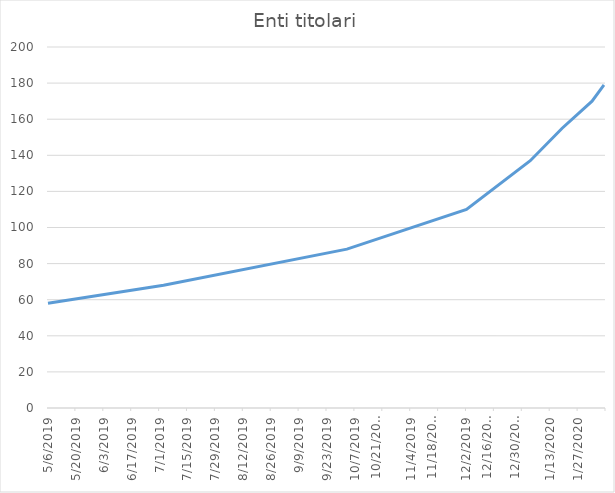
| Category | Enti titolari |
|---|---|
| 5/6/19 | 58 |
| 7/3/19 | 68 |
| 10/3/19 | 88 |
| 12/2/19 | 110 |
| 1/3/20 | 137 |
| 1/19/20 | 155 |
| 2/3/20 | 170 |
| 2/9/20 | 179 |